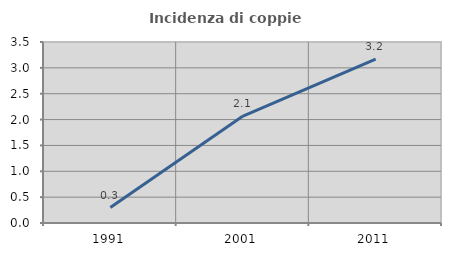
| Category | Incidenza di coppie miste |
|---|---|
| 1991.0 | 0.298 |
| 2001.0 | 2.067 |
| 2011.0 | 3.167 |